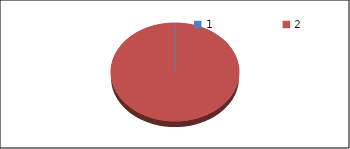
| Category | Series1 |
|---|---|
| 0 | 0 |
| 1 | 25.1 |